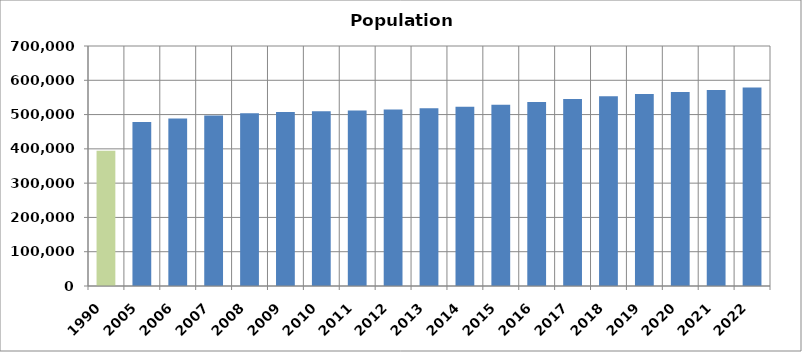
| Category | Population Estimates |
|---|---|
| 1990.0 | 394313.469 |
| 2005.0 | 478344.901 |
| 2006.0 | 488261.751 |
| 2007.0 | 497399.905 |
| 2008.0 | 503546.994 |
| 2009.0 | 507649.096 |
| 2010.0 | 509398.13 |
| 2011.0 | 511666.294 |
| 2012.0 | 514677.777 |
| 2013.0 | 518257.514 |
| 2014.0 | 523052.801 |
| 2015.0 | 528738.218 |
| 2016.0 | 536834.696 |
| 2017.0 | 545175.433 |
| 2018.0 | 553723.448 |
| 2019.0 | 560109.516 |
| 2020.0 | 565818.246 |
| 2021.0 | 571855.712 |
| 2022.0 | 579076.078 |